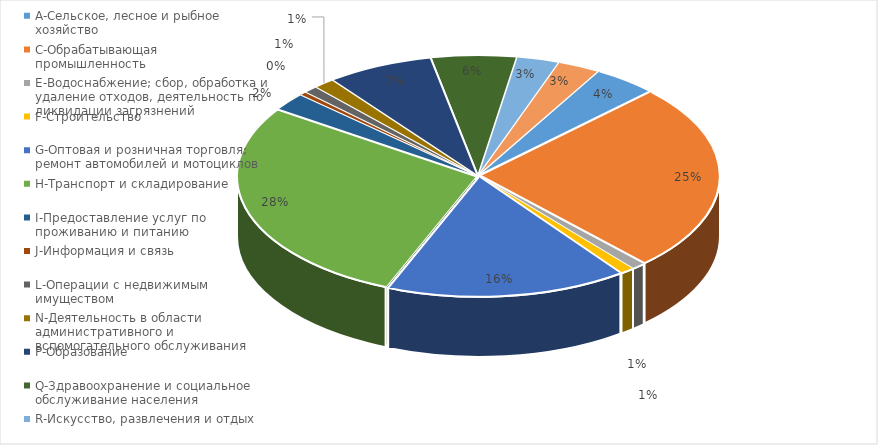
| Category |  Доля, %  |
|---|---|
| A-Сельское, лесное и рыбное хозяйство | 0.043 |
| C-Обрабатывающая промышленность | 0.254 |
| E-Водоснабжение; сбор, обработка и удаление отходов, деятельность по ликвидации загрязнений | 0.01 |
| F-Строительство | 0.01 |
| G-Оптовая и розничная торговля; ремонт автомобилей и мотоциклов | 0.163 |
| H-Транспорт и складирование | 0.282 |
| I-Предоставление услуг по проживанию и питанию | 0.024 |
| J-Информация и связь | 0.005 |
| L-Операции с недвижимым имуществом | 0.01 |
| N-Деятельность в области административного и вспомогательного обслуживания | 0.014 |
| P-Образование | 0.072 |
| Q-Здравоохранение и социальное обслуживание населения | 0.057 |
| R-Искусство, развлечения и отдых | 0.029 |
| S-Предоставление прочих видов услуг | 0.029 |